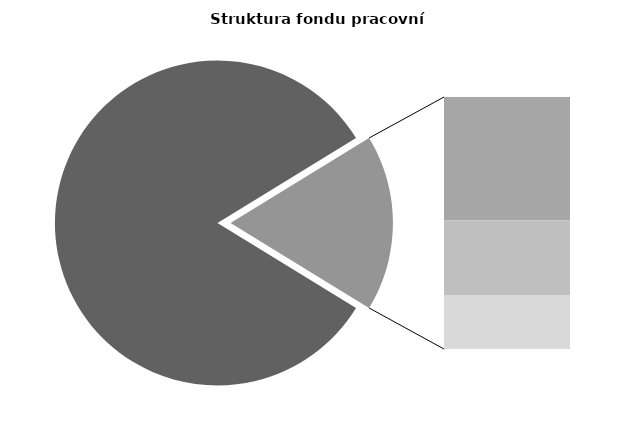
| Category | Series 0 |
|---|---|
| Průměrná měsíční odpracovaná doba bez přesčasu | 140.041 |
| Dovolená | 14.571 |
| Nemoc | 8.794 |
| Jiné | 6.359 |